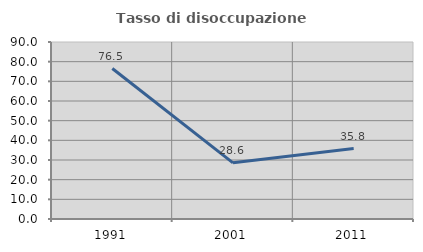
| Category | Tasso di disoccupazione giovanile  |
|---|---|
| 1991.0 | 76.498 |
| 2001.0 | 28.571 |
| 2011.0 | 35.802 |